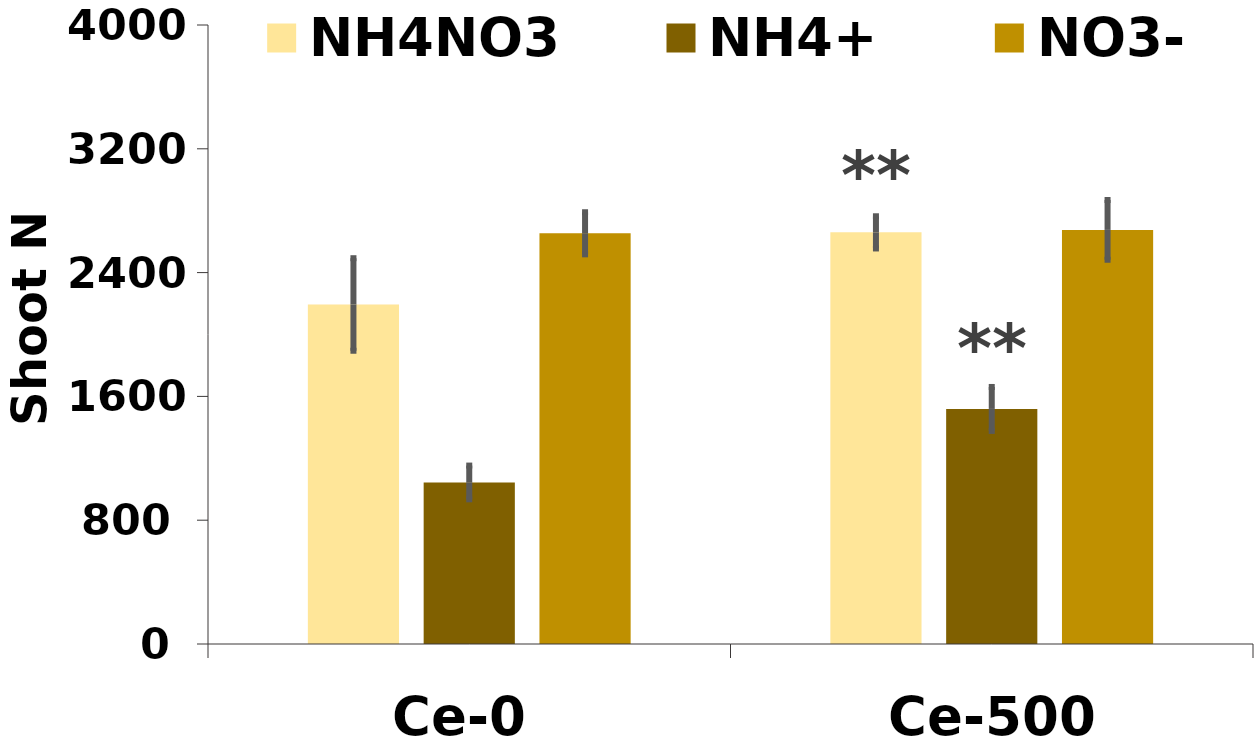
| Category | NH4NO3 | NH4+ | NO3- |
|---|---|---|---|
| Ce-0 | 2194 | 1044 | 2654 |
| Ce-500 | 2660 | 1519 | 2676 |